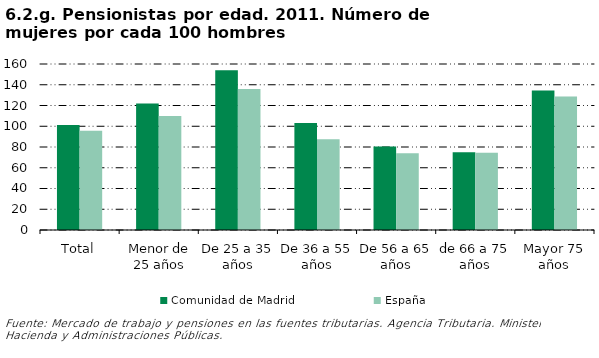
| Category | Comunidad de Madrid | España |
|---|---|---|
| Total | 101.244 | 95.71 |
| Menor de 25 años | 121.825 | 109.923 |
| De 25 a 35 años | 153.997 | 135.813 |
| De 36 a 55 años | 103.212 | 87.537 |
| De 56 a 65 años | 80.538 | 74.013 |
| de 66 a 75 años | 75.027 | 74.349 |
| Mayor 75 años | 134.455 | 128.736 |